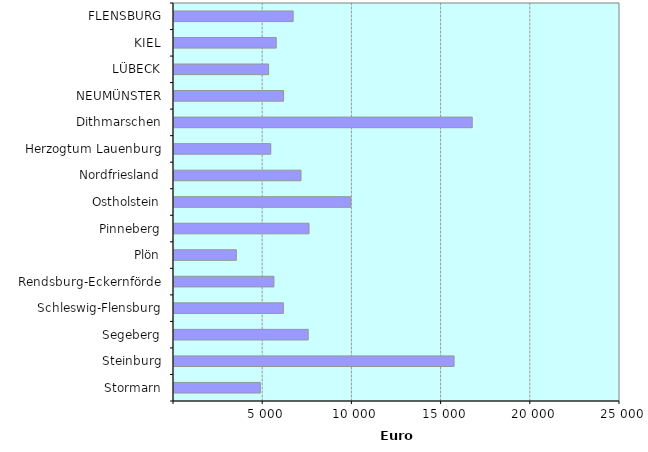
| Category | Series 0 |
|---|---|
| Stormarn | 4838 |
| Steinburg | 15701 |
| Segeberg | 7523 |
| Schleswig-Flensburg | 6131 |
| Rendsburg-Eckernförde | 5602 |
| Plön | 3495 |
| Pinneberg | 7569 |
| Ostholstein | 9906 |
| Nordfriesland | 7119 |
| Herzogtum Lauenburg | 5425 |
| Dithmarschen | 16718 |
| NEUMÜNSTER | 6143 |
| LÜBECK | 5304 |
| KIEL | 5731 |
| FLENSBURG | 6680 |